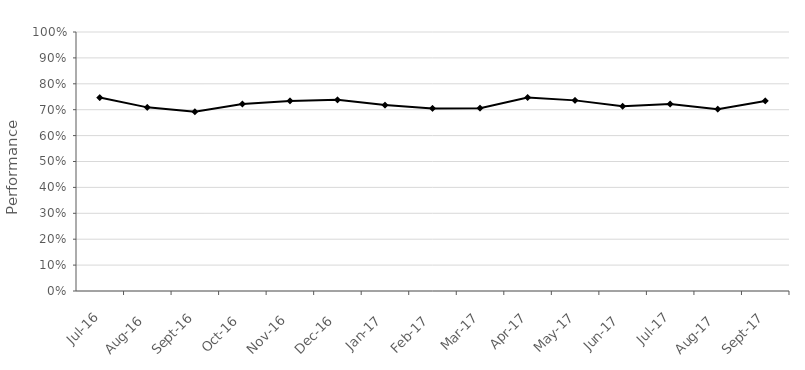
| Category | NPS SL018 |
|---|---|
| 2016-07-01 | 0.747 |
| 2016-08-01 | 0.709 |
| 2016-09-01 | 0.692 |
| 2016-10-01 | 0.722 |
| 2016-11-01 | 0.734 |
| 2016-12-01 | 0.738 |
| 2017-01-01 | 0.718 |
| 2017-02-01 | 0.705 |
| 2017-03-01 | 0.706 |
| 2017-04-01 | 0.747 |
| 2017-05-01 | 0.736 |
| 2017-06-01 | 0.713 |
| 2017-07-01 | 0.722 |
| 2017-08-01 | 0.702 |
| 2017-09-01 | 0.734 |